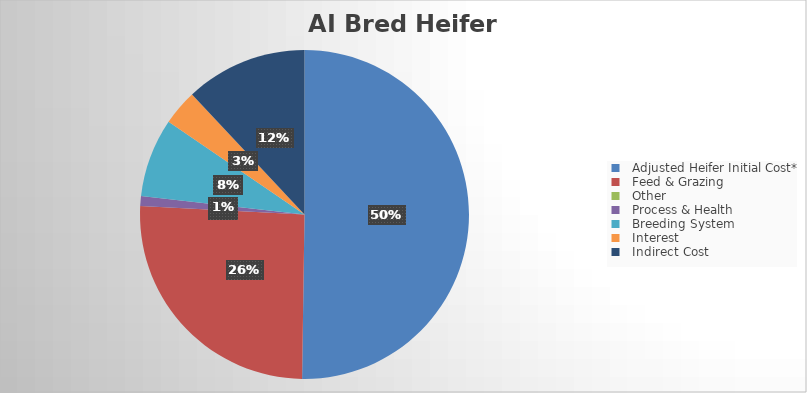
| Category | Series 0 |
|---|---|
|   Adjusted Heifer Initial Cost* | 732.741 |
|   Feed & Grazing  | 373.165 |
|   Other | 0 |
|   Process & Health | 14.205 |
|   Breeding System | 112.781 |
|   Interest  | 51.013 |
|   Indirect Cost | 174.753 |